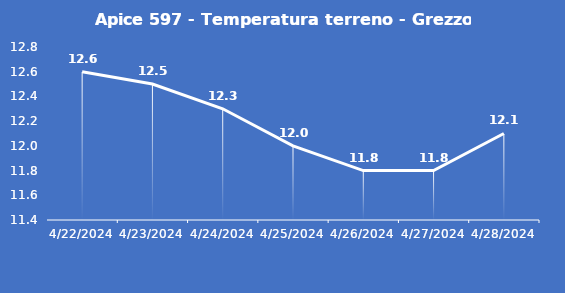
| Category | Apice 597 - Temperatura terreno - Grezzo (°C) |
|---|---|
| 4/22/24 | 12.6 |
| 4/23/24 | 12.5 |
| 4/24/24 | 12.3 |
| 4/25/24 | 12 |
| 4/26/24 | 11.8 |
| 4/27/24 | 11.8 |
| 4/28/24 | 12.1 |